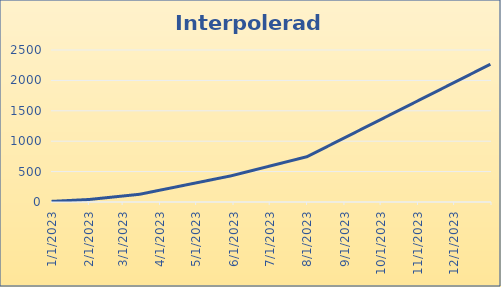
| Category | Series 0 |
|---|---|
| 1/1/23 | 10 |
| 1/2/23 | 11 |
| 1/3/23 | 12 |
| 1/4/23 | 13 |
| 1/5/23 | 14 |
| 1/6/23 | 15 |
| 1/7/23 | 16 |
| 1/8/23 | 17 |
| 1/9/23 | 18 |
| 1/10/23 | 19 |
| 1/11/23 | 20 |
| 1/12/23 | 21 |
| 1/13/23 | 22 |
| 1/14/23 | 23 |
| 1/15/23 | 24 |
| 1/16/23 | 25 |
| 1/17/23 | 26 |
| 1/18/23 | 27 |
| 1/19/23 | 28 |
| 1/20/23 | 29 |
| 1/21/23 | 30 |
| 1/22/23 | 31 |
| 1/23/23 | 32 |
| 1/24/23 | 33 |
| 1/25/23 | 34 |
| 1/26/23 | 35 |
| 1/27/23 | 36 |
| 1/28/23 | 37 |
| 1/29/23 | 38 |
| 1/30/23 | 39 |
| 1/31/23 | 40 |
| 2/1/23 | 41 |
| 2/2/23 | 43.048 |
| 2/3/23 | 45.095 |
| 2/4/23 | 47.143 |
| 2/5/23 | 49.19 |
| 2/6/23 | 51.238 |
| 2/7/23 | 53.286 |
| 2/8/23 | 55.333 |
| 2/9/23 | 57.381 |
| 2/10/23 | 59.429 |
| 2/11/23 | 61.476 |
| 2/12/23 | 63.524 |
| 2/13/23 | 65.571 |
| 2/14/23 | 67.619 |
| 2/15/23 | 69.667 |
| 2/16/23 | 71.714 |
| 2/17/23 | 73.762 |
| 2/18/23 | 75.81 |
| 2/19/23 | 77.857 |
| 2/20/23 | 79.905 |
| 2/21/23 | 81.952 |
| 2/22/23 | 84 |
| 2/23/23 | 86.048 |
| 2/24/23 | 88.095 |
| 2/25/23 | 90.143 |
| 2/26/23 | 92.19 |
| 2/27/23 | 94.238 |
| 2/28/23 | 96.286 |
| 3/1/23 | 98.333 |
| 3/2/23 | 100.381 |
| 3/3/23 | 102.429 |
| 3/4/23 | 104.476 |
| 3/5/23 | 106.524 |
| 3/6/23 | 108.571 |
| 3/7/23 | 110.619 |
| 3/8/23 | 112.667 |
| 3/9/23 | 114.714 |
| 3/10/23 | 116.762 |
| 3/11/23 | 118.81 |
| 3/12/23 | 120.857 |
| 3/13/23 | 122.905 |
| 3/14/23 | 124.952 |
| 3/15/23 | 127 |
| 3/16/23 | 131 |
| 3/17/23 | 135 |
| 3/18/23 | 139 |
| 3/19/23 | 143 |
| 3/20/23 | 147 |
| 3/21/23 | 151 |
| 3/22/23 | 155 |
| 3/23/23 | 159 |
| 3/24/23 | 163 |
| 3/25/23 | 167 |
| 3/26/23 | 171 |
| 3/27/23 | 175 |
| 3/28/23 | 179 |
| 3/29/23 | 183 |
| 3/30/23 | 187 |
| 3/31/23 | 191 |
| 4/1/23 | 195 |
| 4/2/23 | 199 |
| 4/3/23 | 203 |
| 4/4/23 | 207 |
| 4/5/23 | 211 |
| 4/6/23 | 215 |
| 4/7/23 | 219 |
| 4/8/23 | 223 |
| 4/9/23 | 227 |
| 4/10/23 | 231 |
| 4/11/23 | 235 |
| 4/12/23 | 239 |
| 4/13/23 | 243 |
| 4/14/23 | 247 |
| 4/15/23 | 251 |
| 4/16/23 | 255 |
| 4/17/23 | 259 |
| 4/18/23 | 263 |
| 4/19/23 | 267 |
| 4/20/23 | 271 |
| 4/21/23 | 275 |
| 4/22/23 | 279 |
| 4/23/23 | 283 |
| 4/24/23 | 287 |
| 4/25/23 | 291 |
| 4/26/23 | 295 |
| 4/27/23 | 299 |
| 4/28/23 | 303 |
| 4/29/23 | 307 |
| 4/30/23 | 311 |
| 5/1/23 | 315 |
| 5/2/23 | 319 |
| 5/3/23 | 323 |
| 5/4/23 | 327 |
| 5/5/23 | 331 |
| 5/6/23 | 335 |
| 5/7/23 | 339 |
| 5/8/23 | 343 |
| 5/9/23 | 347 |
| 5/10/23 | 351 |
| 5/11/23 | 355 |
| 5/12/23 | 359 |
| 5/13/23 | 363 |
| 5/14/23 | 367 |
| 5/15/23 | 371 |
| 5/16/23 | 375 |
| 5/17/23 | 379 |
| 5/18/23 | 383 |
| 5/19/23 | 387 |
| 5/20/23 | 391 |
| 5/21/23 | 395 |
| 5/22/23 | 399 |
| 5/23/23 | 403 |
| 5/24/23 | 407 |
| 5/25/23 | 411 |
| 5/26/23 | 415 |
| 5/27/23 | 419 |
| 5/28/23 | 423 |
| 5/29/23 | 427 |
| 5/30/23 | 431 |
| 5/31/23 | 436 |
| 6/1/23 | 441 |
| 6/2/23 | 446 |
| 6/3/23 | 451 |
| 6/4/23 | 456 |
| 6/5/23 | 461 |
| 6/6/23 | 466 |
| 6/7/23 | 471 |
| 6/8/23 | 476 |
| 6/9/23 | 481 |
| 6/10/23 | 486 |
| 6/11/23 | 491 |
| 6/12/23 | 496 |
| 6/13/23 | 501 |
| 6/14/23 | 506 |
| 6/15/23 | 511 |
| 6/16/23 | 516 |
| 6/17/23 | 521 |
| 6/18/23 | 526 |
| 6/19/23 | 531 |
| 6/20/23 | 536 |
| 6/21/23 | 541 |
| 6/22/23 | 546 |
| 6/23/23 | 551 |
| 6/24/23 | 556 |
| 6/25/23 | 561 |
| 6/26/23 | 566 |
| 6/27/23 | 571 |
| 6/28/23 | 576 |
| 6/29/23 | 581 |
| 6/30/23 | 586 |
| 7/1/23 | 591 |
| 7/2/23 | 596 |
| 7/3/23 | 601 |
| 7/4/23 | 606 |
| 7/5/23 | 611 |
| 7/6/23 | 616 |
| 7/7/23 | 621 |
| 7/8/23 | 626 |
| 7/9/23 | 631 |
| 7/10/23 | 636 |
| 7/11/23 | 641 |
| 7/12/23 | 646 |
| 7/13/23 | 651 |
| 7/14/23 | 656 |
| 7/15/23 | 661 |
| 7/16/23 | 666 |
| 7/17/23 | 671 |
| 7/18/23 | 676 |
| 7/19/23 | 681 |
| 7/20/23 | 686 |
| 7/21/23 | 691 |
| 7/22/23 | 696 |
| 7/23/23 | 701 |
| 7/24/23 | 706 |
| 7/25/23 | 711 |
| 7/26/23 | 716 |
| 7/27/23 | 721 |
| 7/28/23 | 726 |
| 7/29/23 | 731 |
| 7/30/23 | 736 |
| 7/31/23 | 741 |
| 8/1/23 | 746 |
| 8/2/23 | 756 |
| 8/3/23 | 766 |
| 8/4/23 | 776 |
| 8/5/23 | 786 |
| 8/6/23 | 796 |
| 8/7/23 | 806 |
| 8/8/23 | 816 |
| 8/9/23 | 826 |
| 8/10/23 | 836 |
| 8/11/23 | 846 |
| 8/12/23 | 856 |
| 8/13/23 | 866 |
| 8/14/23 | 876 |
| 8/15/23 | 886 |
| 8/16/23 | 896 |
| 8/17/23 | 906 |
| 8/18/23 | 916 |
| 8/19/23 | 926 |
| 8/20/23 | 936 |
| 8/21/23 | 946 |
| 8/22/23 | 956 |
| 8/23/23 | 966 |
| 8/24/23 | 976 |
| 8/25/23 | 986 |
| 8/26/23 | 996 |
| 8/27/23 | 1006 |
| 8/28/23 | 1016 |
| 8/29/23 | 1026 |
| 8/30/23 | 1036 |
| 8/31/23 | 1046 |
| 9/1/23 | 1056 |
| 9/2/23 | 1066 |
| 9/3/23 | 1076 |
| 9/4/23 | 1086 |
| 9/5/23 | 1096 |
| 9/6/23 | 1106 |
| 9/7/23 | 1116 |
| 9/8/23 | 1126 |
| 9/9/23 | 1136 |
| 9/10/23 | 1146 |
| 9/11/23 | 1156 |
| 9/12/23 | 1166 |
| 9/13/23 | 1176 |
| 9/14/23 | 1186 |
| 9/15/23 | 1196 |
| 9/16/23 | 1206 |
| 9/17/23 | 1216 |
| 9/18/23 | 1226 |
| 9/19/23 | 1236 |
| 9/20/23 | 1246 |
| 9/21/23 | 1256 |
| 9/22/23 | 1266 |
| 9/23/23 | 1276 |
| 9/24/23 | 1286 |
| 9/25/23 | 1296 |
| 9/26/23 | 1306 |
| 9/27/23 | 1316 |
| 9/28/23 | 1326 |
| 9/29/23 | 1336 |
| 9/30/23 | 1346 |
| 10/1/23 | 1356 |
| 10/2/23 | 1366 |
| 10/3/23 | 1376 |
| 10/4/23 | 1386 |
| 10/5/23 | 1396 |
| 10/6/23 | 1406 |
| 10/7/23 | 1416 |
| 10/8/23 | 1426 |
| 10/9/23 | 1436 |
| 10/10/23 | 1446 |
| 10/11/23 | 1456 |
| 10/12/23 | 1466 |
| 10/13/23 | 1476 |
| 10/14/23 | 1486 |
| 10/15/23 | 1496 |
| 10/16/23 | 1506 |
| 10/17/23 | 1516 |
| 10/18/23 | 1526 |
| 10/19/23 | 1536 |
| 10/20/23 | 1546 |
| 10/21/23 | 1556 |
| 10/22/23 | 1566 |
| 10/23/23 | 1576 |
| 10/24/23 | 1586 |
| 10/25/23 | 1596 |
| 10/26/23 | 1606 |
| 10/27/23 | 1616 |
| 10/28/23 | 1626 |
| 10/29/23 | 1636 |
| 10/30/23 | 1646 |
| 10/31/23 | 1656 |
| 11/1/23 | 1666 |
| 11/2/23 | 1676 |
| 11/3/23 | 1686 |
| 11/4/23 | 1696 |
| 11/5/23 | 1706 |
| 11/6/23 | 1716 |
| 11/7/23 | 1726 |
| 11/8/23 | 1736 |
| 11/9/23 | 1746 |
| 11/10/23 | 1756 |
| 11/11/23 | 1766 |
| 11/12/23 | 1776 |
| 11/13/23 | 1786 |
| 11/14/23 | 1796 |
| 11/15/23 | 1806 |
| 11/16/23 | 1816 |
| 11/17/23 | 1826 |
| 11/18/23 | 1836 |
| 11/19/23 | 1846 |
| 11/20/23 | 1856 |
| 11/21/23 | 1866 |
| 11/22/23 | 1876 |
| 11/23/23 | 1886 |
| 11/24/23 | 1896 |
| 11/25/23 | 1906 |
| 11/26/23 | 1916 |
| 11/27/23 | 1926 |
| 11/28/23 | 1936 |
| 11/29/23 | 1946 |
| 11/30/23 | 1956 |
| 12/1/23 | 1966 |
| 12/2/23 | 1976 |
| 12/3/23 | 1986 |
| 12/4/23 | 1996 |
| 12/5/23 | 2006 |
| 12/6/23 | 2016 |
| 12/7/23 | 2026 |
| 12/8/23 | 2036 |
| 12/9/23 | 2046 |
| 12/10/23 | 2056 |
| 12/11/23 | 2066 |
| 12/12/23 | 2076 |
| 12/13/23 | 2086 |
| 12/14/23 | 2096 |
| 12/15/23 | 2106 |
| 12/16/23 | 2116 |
| 12/17/23 | 2126 |
| 12/18/23 | 2136 |
| 12/19/23 | 2146 |
| 12/20/23 | 2156 |
| 12/21/23 | 2166 |
| 12/22/23 | 2176 |
| 12/23/23 | 2186 |
| 12/24/23 | 2196 |
| 12/25/23 | 2206 |
| 12/26/23 | 2216 |
| 12/27/23 | 2226 |
| 12/28/23 | 2236 |
| 12/29/23 | 2246 |
| 12/30/23 | 2256 |
| 12/31/23 | 2266 |